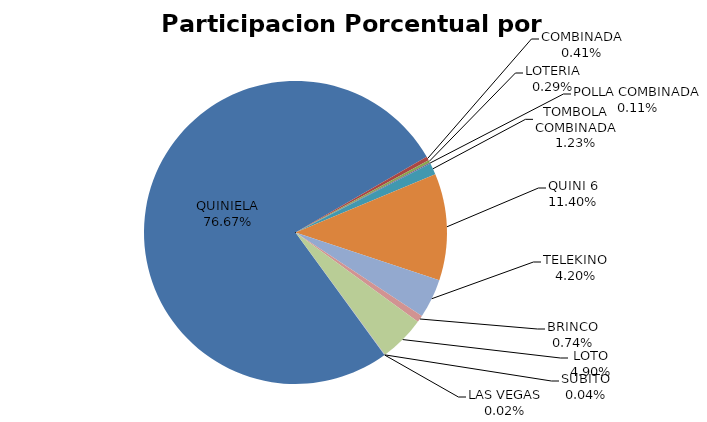
| Category | Series 0 |
|---|---|
| QUINIELA | 26908704.19 |
| COMBINADA | 143311.36 |
| LOTERIA | 100316.538 |
| POLLA COMBINADA | 38406 |
| TOMBOLA COMBINADA | 433165.5 |
| QUINI 6 | 3999680.4 |
| TELEKINO | 1473088.5 |
| BRINCO | 260444.651 |
| LOTO | 1721227.6 |
| SUBITO | 13514.4 |
| LAS VEGAS | 5879.43 |